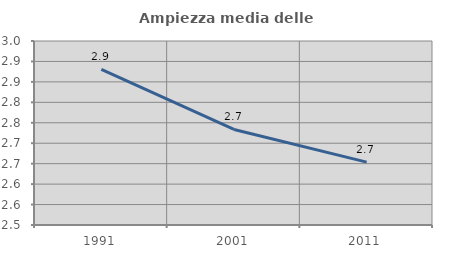
| Category | Ampiezza media delle famiglie |
|---|---|
| 1991.0 | 2.88 |
| 2001.0 | 2.734 |
| 2011.0 | 2.654 |